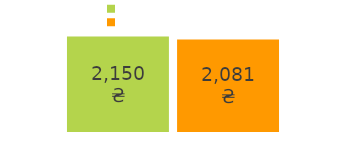
| Category | надходження | витрати |
|---|---|---|
| грошові надходження: | 2150 | 2081 |